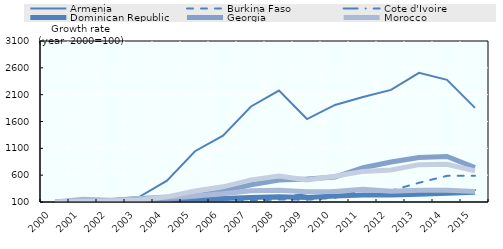
| Category | Armenia | Burkina Faso | Cote d'Ivoire | Dominican Republic | Georgia | Morocco | Average |
|---|---|---|---|---|---|---|---|
| 2000.0 | 100 | 100 | 100 | 100 | 100 | 100 | 100 |
| 2001.0 | 107.909 | 74.13 | 97.479 | 107.826 | 105.739 | 150.922 | 107.334 |
| 2002.0 | 149.963 | 87.227 | 100.844 | 119.293 | 110.15 | 133.33 | 116.801 |
| 2003.0 | 191.881 | 79.821 | 119.328 | 126.359 | 112.606 | 167.125 | 132.853 |
| 2004.0 | 497.024 | 65.965 | 133.621 | 135.924 | 144.56 | 195.365 | 195.41 |
| 2005.0 | 1046.337 | 84.12 | 137.121 | 147.783 | 212.842 | 212.459 | 306.777 |
| 2006.0 | 1336.656 | 100.892 | 140.136 | 165.967 | 299.383 | 252.372 | 382.568 |
| 2007.0 | 1879.93 | 125.231 | 155.204 | 184.62 | 421.416 | 311.588 | 512.998 |
| 2008.0 | 2176.823 | 147.531 | 167.157 | 195.951 | 508.249 | 319.172 | 585.814 |
| 2009.0 | 1646.061 | 142.552 | 264.772 | 185.582 | 530.487 | 290.229 | 509.947 |
| 2010.0 | 1908.468 | 178.725 | 313.847 | 211.25 | 564.997 | 297.332 | 579.103 |
| 2011.0 | 2056.276 | 327.881 | 333.28 | 230.473 | 738.39 | 335.932 | 670.372 |
| 2012.0 | 2189.304 | 311.862 | 308.493 | 231.636 | 844.733 | 301.284 | 697.885 |
| 2013.0 | 2506.224 | 457.981 | 323.251 | 243.777 | 928.328 | 318.589 | 796.358 |
| 2014.0 | 2376.379 | 587.778 | 323.251 | 261.435 | 947.985 | 320.501 | 802.888 |
| 2015.0 | 1854.287 | 587.778 | 323.251 | 279.843 | 741.847 | 297.137 | 680.691 |